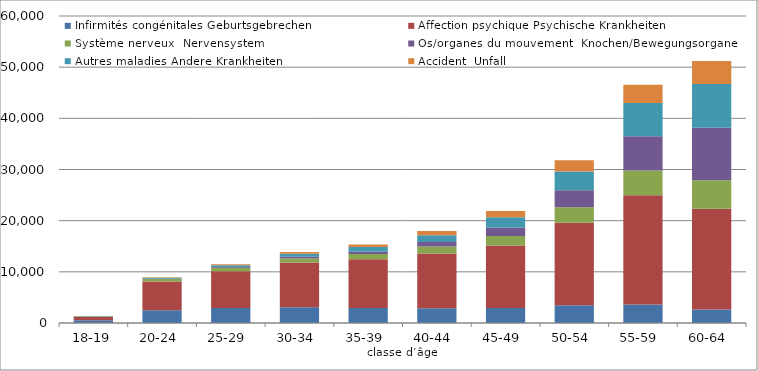
| Category | Infirmités congénitales | Affection psychique | Système nerveux  | Os/organes du mouvement  | Autres maladies | Accident  |
|---|---|---|---|---|---|---|
| 18-19 | 529 | 689 | 95 | 13 | 24 | 11 |
| 20-24  | 2501 | 5625 | 452 | 92 | 165 | 87 |
| 25-29  | 2934 | 7199 | 656 | 136 | 378 | 155 |
| 30-34  | 3087 | 8729 | 806 | 327 | 569 | 364 |
| 35-39  | 2920 | 9540 | 1017 | 456 | 911 | 504 |
| 40-44  | 2903 | 10662 | 1410 | 863 | 1331 | 797 |
| 45-49  | 2956 | 12171 | 1898 | 1628 | 2030 | 1208 |
| 50-54  | 3445 | 16140 | 3060 | 3312 | 3675 | 2152 |
| 55-59  | 3605 | 21383 | 4819 | 6696 | 6499 | 3558 |
| 60-64  | 2659 | 19670 | 5576 | 10255 | 8551 | 4475 |